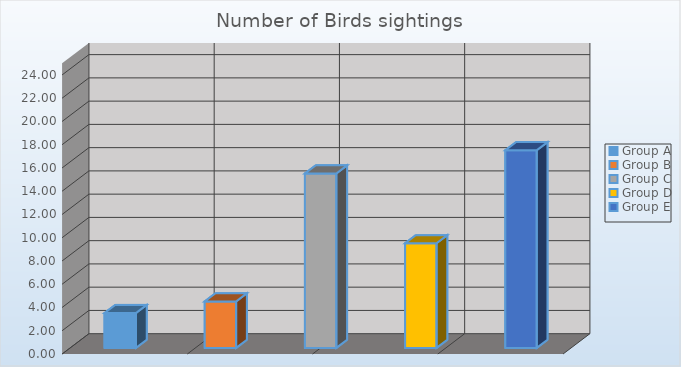
| Category | Birds # |
|---|---|
| Group A | 3 |
| Group B | 4 |
| Group C | 15 |
| Group D | 9 |
| Group E | 17 |